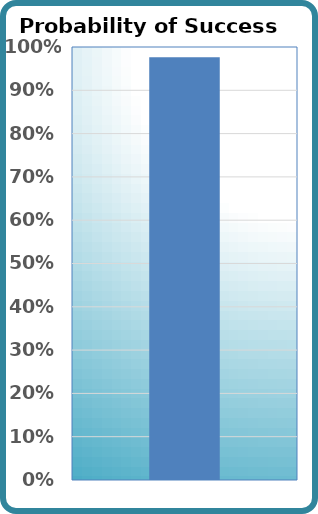
| Category | Probability of Success |
|---|---|
| 0 | 0.976 |